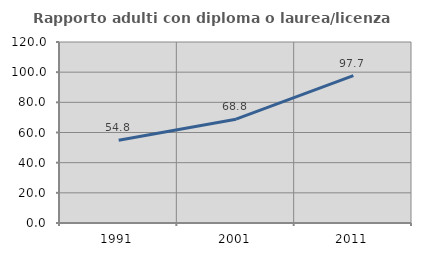
| Category | Rapporto adulti con diploma o laurea/licenza media  |
|---|---|
| 1991.0 | 54.818 |
| 2001.0 | 68.806 |
| 2011.0 | 97.689 |